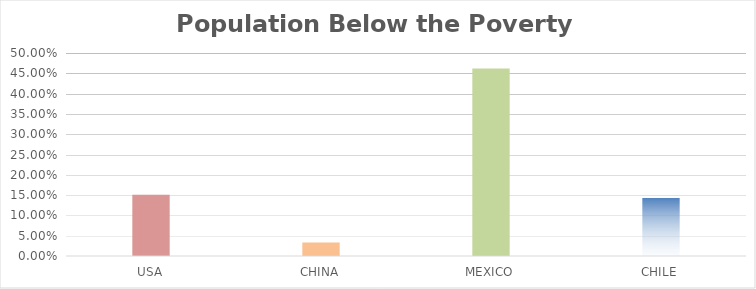
| Category | Population Below the Poverty Line |
|---|---|
| USA | 0.151 |
| CHINA | 0.033 |
| MEXICO | 0.462 |
| CHILE | 0.144 |